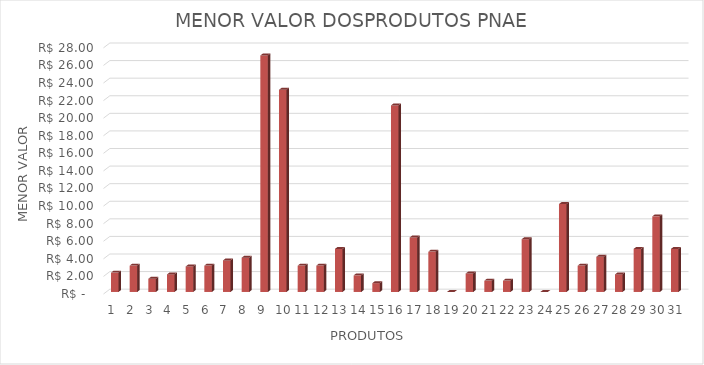
| Category | Series 0 |
|---|---|
| 0 | 2.2 |
| 1 | 3 |
| 2 | 1.5 |
| 3 | 2 |
| 4 | 2.9 |
| 5 | 3 |
| 6 | 3.59 |
| 7 | 3.9 |
| 8 | 26.9 |
| 9 | 23 |
| 10 | 3 |
| 11 | 3 |
| 12 | 4.9 |
| 13 | 1.89 |
| 14 | 1 |
| 15 | 21.22 |
| 16 | 6.2 |
| 17 | 4.59 |
| 18 | 0 |
| 19 | 2.1 |
| 20 | 1.29 |
| 21 | 1.29 |
| 22 | 6 |
| 23 | 0 |
| 24 | 10 |
| 25 | 3 |
| 26 | 4 |
| 27 | 2 |
| 28 | 4.9 |
| 29 | 8.6 |
| 30 | 4.9 |